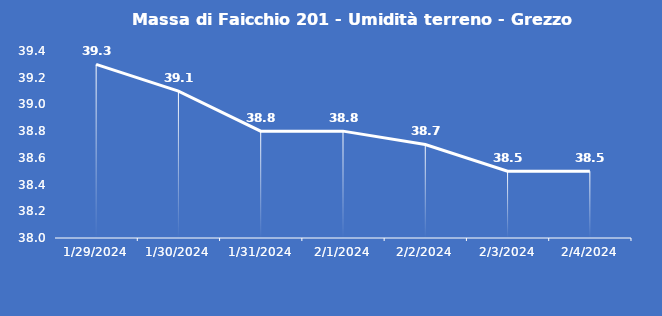
| Category | Massa di Faicchio 201 - Umidità terreno - Grezzo (%VWC) |
|---|---|
| 1/29/24 | 39.3 |
| 1/30/24 | 39.1 |
| 1/31/24 | 38.8 |
| 2/1/24 | 38.8 |
| 2/2/24 | 38.7 |
| 2/3/24 | 38.5 |
| 2/4/24 | 38.5 |